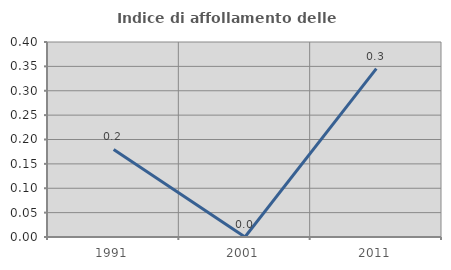
| Category | Indice di affollamento delle abitazioni  |
|---|---|
| 1991.0 | 0.18 |
| 2001.0 | 0 |
| 2011.0 | 0.345 |